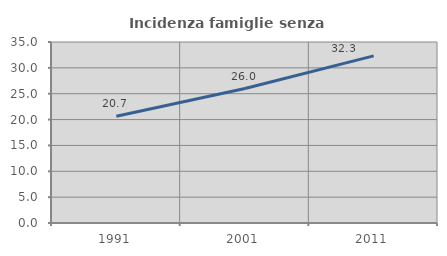
| Category | Incidenza famiglie senza nuclei |
|---|---|
| 1991.0 | 20.651 |
| 2001.0 | 25.998 |
| 2011.0 | 32.324 |